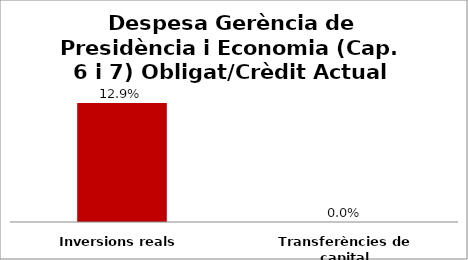
| Category | Series 0 |
|---|---|
| Inversions reals | 0.129 |
| Transferències de capital | 0 |